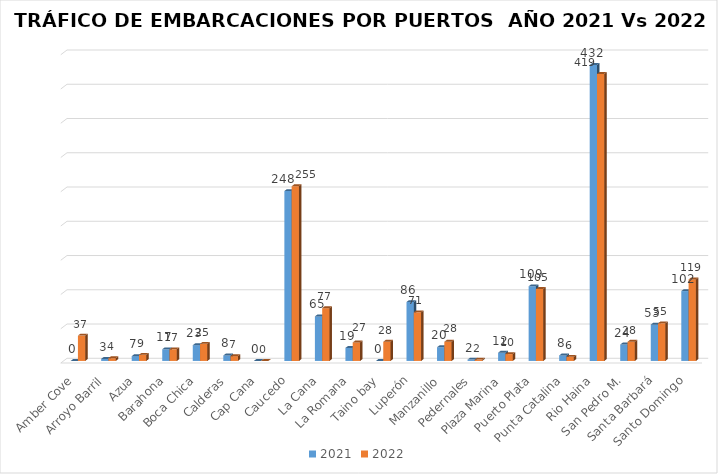
| Category | 2021 | 2022 |
|---|---|---|
| Amber Cove | 0 | 37 |
| Arroyo Barril | 3 | 4 |
| Azua | 7 | 9 |
| Barahona | 17 | 17 |
| Boca Chica | 23 | 25 |
| Calderas | 8 | 7 |
| Cap Cana | 0 | 0 |
| Caucedo | 248 | 255 |
| La Cana | 65 | 77 |
| La Romana | 19 | 27 |
| Taino bay | 0 | 28 |
| Luperón | 86 | 71 |
| Manzanillo | 20 | 28 |
| Pedernales | 2 | 2 |
| Plaza Marina | 12 | 10 |
| Puerto Plata | 109 | 105 |
| Punta Catalina | 8 | 6 |
| Rio Haina | 432 | 419 |
| San Pedro M. | 24 | 28 |
| Santa Barbará | 53 | 55 |
| Santo Domingo | 102 | 119 |